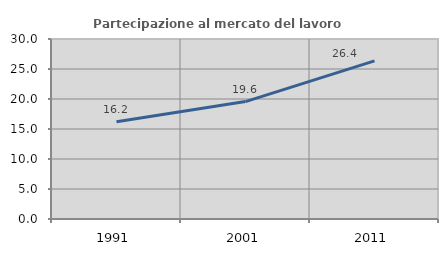
| Category | Partecipazione al mercato del lavoro  femminile |
|---|---|
| 1991.0 | 16.223 |
| 2001.0 | 19.572 |
| 2011.0 | 26.357 |